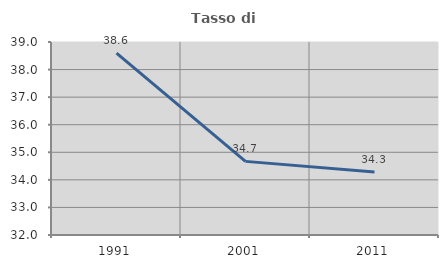
| Category | Tasso di occupazione   |
|---|---|
| 1991.0 | 38.598 |
| 2001.0 | 34.67 |
| 2011.0 | 34.289 |